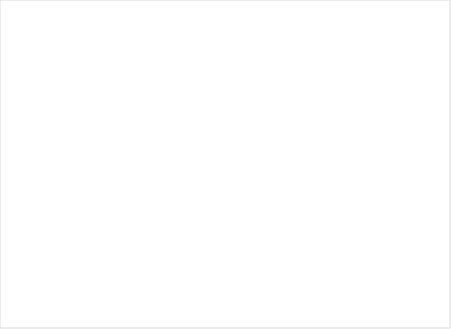
| Category | Total |
|---|---|
| Ja, af og til | 4 |